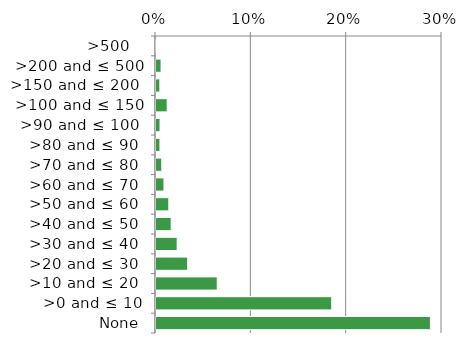
| Category | Native |
|---|---|
|  None | 0.289 |
| >0 and ≤ 10 | 0.185 |
| >10 and ≤ 20  | 0.065 |
| >20 and ≤ 30  | 0.034 |
| >30 and ≤ 40  | 0.023 |
| >40 and ≤ 50  | 0.017 |
| >50 and ≤ 60  | 0.014 |
| >60 and ≤ 70  | 0.009 |
| >70 and ≤ 80  | 0.007 |
| >80 and ≤ 90  | 0.005 |
| >90 and ≤ 100  | 0.005 |
| >100 and ≤ 150 | 0.013 |
| >150 and ≤ 200  | 0.005 |
| >200 and ≤ 500 | 0.006 |
| >500   | 0.001 |